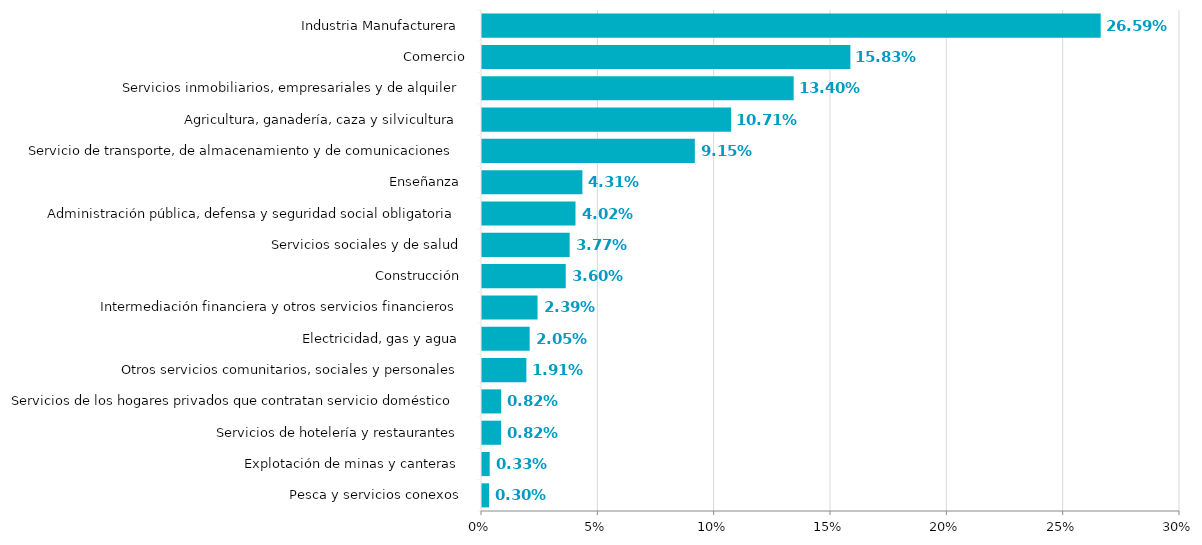
| Category | Series 0 |
|---|---|
| Pesca y servicios conexos  | 0.003 |
| Explotación de minas y canteras  | 0.003 |
| Servicios de hotelería y restaurantes  | 0.008 |
| Servicios de los hogares privados que contratan servicio doméstico  | 0.008 |
| Otros servicios comunitarios, sociales y personales  | 0.019 |
| Electricidad, gas y agua  | 0.02 |
| Intermediación financiera y otros servicios financieros  | 0.024 |
| Construcción  | 0.036 |
| Servicios sociales y de salud  | 0.038 |
| Administración pública, defensa y seguridad social obligatoria  | 0.04 |
| Enseñanza  | 0.043 |
| Servicio de transporte, de almacenamiento y de comunicaciones  | 0.091 |
| Agricultura, ganadería, caza y silvicultura  | 0.107 |
| Servicios inmobiliarios, empresariales y de alquiler  | 0.134 |
| Comercio | 0.158 |
| Industria Manufacturera  | 0.266 |